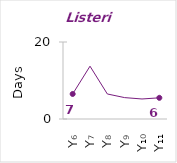
| Category | Listeria |
|---|---|
| Y₆ | 6.5 |
| Y₇ | 13.714 |
| Y₈ | 6.5 |
| Y₉ | 5.556 |
| Y₁₀ | 5.2 |
| Y₁₁ | 5.5 |